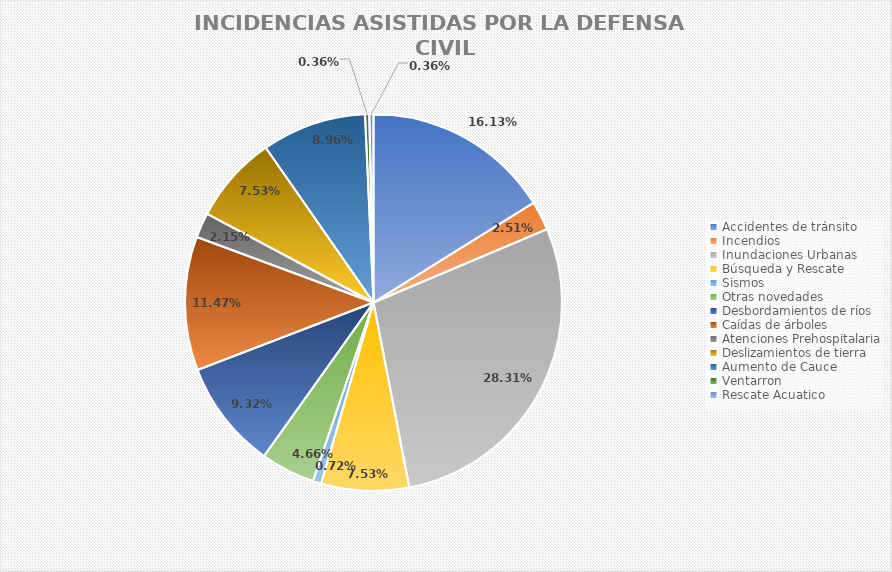
| Category | Series 0 |
|---|---|
| Accidentes de tránsito | 45 |
| Incendios | 7 |
| Inundaciones Urbanas | 79 |
| Búsqueda y Rescate | 21 |
| Sismos | 2 |
| Otras novedades | 13 |
| Desbordamientos de ríos | 26 |
| Caídas de árboles | 32 |
| Atenciones Prehospitalaria | 6 |
| Deslizamientos de tierra | 21 |
| Aumento de Cauce | 25 |
| Ventarron | 1 |
| Rescate Acuatico | 1 |